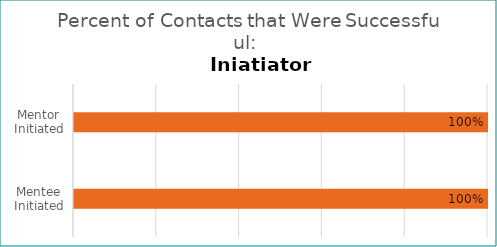
| Category | Percent Successful |
|---|---|
| Mentor Initiated | 1 |
| Mentee Initiated | 1 |